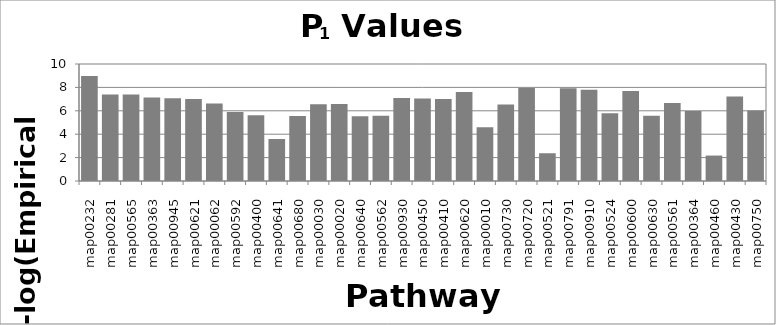
| Category | Series 0 |
|---|---|
| map00232 | 8.972 |
| map00281 | 7.403 |
| map00565 | 7.39 |
| map00363 | 7.132 |
| map00945 | 7.068 |
| map00621 | 7.004 |
| map00062 | 6.618 |
| map00592 | 5.896 |
| map00400 | 5.615 |
| map00641 | 3.588 |
| map00680 | 5.566 |
| map00030 | 6.563 |
| map00020 | 6.591 |
| map00640 | 5.539 |
| map00562 | 5.584 |
| map00930 | 7.099 |
| map00450 | 7.061 |
| map00410 | 6.999 |
| map00620 | 7.6 |
| map00010 | 4.596 |
| map00730 | 6.544 |
| map00720 | 7.945 |
| map00521 | 2.371 |
| map00791 | 7.919 |
| map00910 | 7.803 |
| map00524 | 5.783 |
| map00600 | 7.686 |
| map00630 | 5.576 |
| map00561 | 6.667 |
| map00364 | 5.986 |
| map00460 | 2.173 |
| map00430 | 7.221 |
| map00750 | 6.022 |